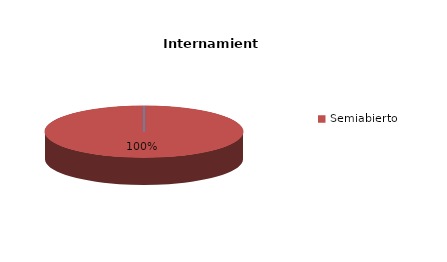
| Category | Series 0 |
|---|---|
| Cerrado | 0 |
| Semiabierto | 35 |
| Abierto | 0 |
| Terapeúticos | 0 |